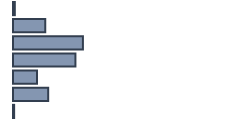
| Category | Series 0 |
|---|---|
| 0 | 0.8 |
| 1 | 14.2 |
| 2 | 30.8 |
| 3 | 27.5 |
| 4 | 10.6 |
| 5 | 15.5 |
| 6 | 0.5 |